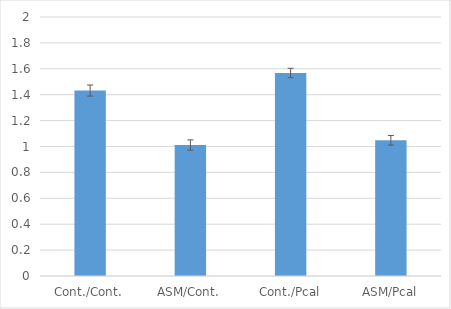
| Category | Series 0 |
|---|---|
| Cont./Cont. | 1.432 |
| ASM/Cont. | 1.012 |
| Cont./Pcal | 1.568 |
| ASM/Pcal | 1.048 |